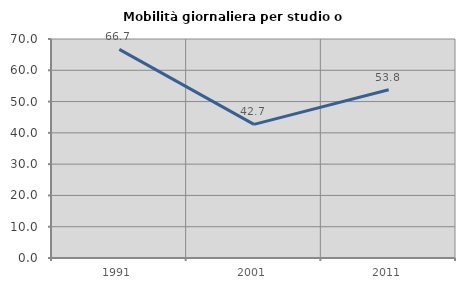
| Category | Mobilità giornaliera per studio o lavoro |
|---|---|
| 1991.0 | 66.667 |
| 2001.0 | 42.708 |
| 2011.0 | 53.763 |